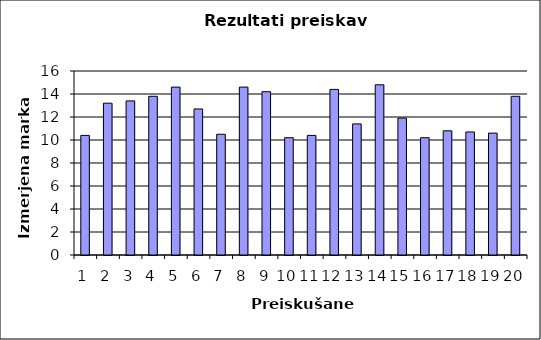
| Category | Series 0 |
|---|---|
| 0 | 10.4 |
| 1 | 13.2 |
| 2 | 13.4 |
| 3 | 13.8 |
| 4 | 14.6 |
| 5 | 12.7 |
| 6 | 10.5 |
| 7 | 14.6 |
| 8 | 14.2 |
| 9 | 10.2 |
| 10 | 10.4 |
| 11 | 14.4 |
| 12 | 11.4 |
| 13 | 14.8 |
| 14 | 11.9 |
| 15 | 10.2 |
| 16 | 10.8 |
| 17 | 10.7 |
| 18 | 10.6 |
| 19 | 13.8 |